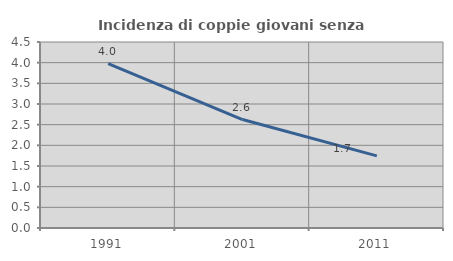
| Category | Incidenza di coppie giovani senza figli |
|---|---|
| 1991.0 | 3.979 |
| 2001.0 | 2.624 |
| 2011.0 | 1.745 |